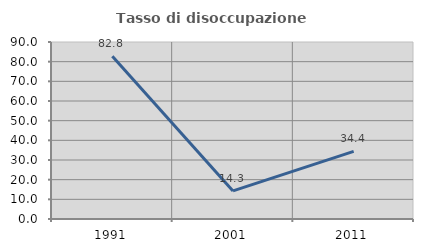
| Category | Tasso di disoccupazione giovanile  |
|---|---|
| 1991.0 | 82.796 |
| 2001.0 | 14.286 |
| 2011.0 | 34.375 |